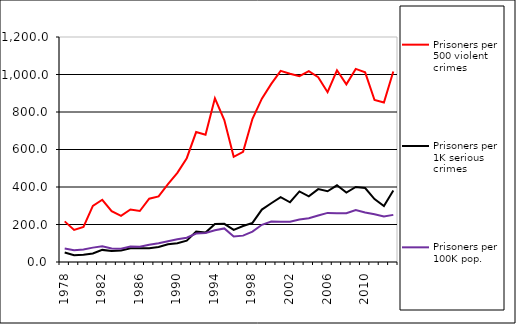
| Category | Prisoners per 500 violent crimes | Prisoners per 1K serious crimes | Prisoners per 100K pop. |
|---|---|---|---|
| 1978.0 | 216.667 | 50.489 | 72.074 |
| 1979.0 | 171.256 | 35.801 | 63.083 |
| 1980.0 | 187.09 | 39.22 | 66.888 |
| 1981.0 | 299.697 | 45.444 | 76.699 |
| 1982.0 | 332.061 | 64.588 | 84.302 |
| 1983.0 | 271.552 | 58.879 | 72 |
| 1984.0 | 245.774 | 61.404 | 71.321 |
| 1985.0 | 280.38 | 73.833 | 82.804 |
| 1986.0 | 271.995 | 73.881 | 81.146 |
| 1987.0 | 337.567 | 73.906 | 92.153 |
| 1988.0 | 349.558 | 80.273 | 99.46 |
| 1989.0 | 415.671 | 95.021 | 110.406 |
| 1990.0 | 475.559 | 99.634 | 121.011 |
| 1991.0 | 553.625 | 113.714 | 129.277 |
| 1992.0 | 693.109 | 162.289 | 151.754 |
| 1993.0 | 678.571 | 156.832 | 155.035 |
| 1994.0 | 872.776 | 202.854 | 169.138 |
| 1995.0 | 757.225 | 203.772 | 179.145 |
| 1996.0 | 560.924 | 171.227 | 135.993 |
| 1997.0 | 587.234 | 191.844 | 140.577 |
| 1998.0 | 763.535 | 208.751 | 162.267 |
| 1999.0 | 871.302 | 279.611 | 198.403 |
| 2000.0 | 950.072 | 313.216 | 215.661 |
| 2001.0 | 1019.41 | 346.073 | 214.2 |
| 2002.0 | 1003.799 | 318.544 | 214.306 |
| 2003.0 | 990.806 | 376.208 | 226.207 |
| 2004.0 | 1017.532 | 349.807 | 233.568 |
| 2005.0 | 985.934 | 388.707 | 247.756 |
| 2006.0 | 905.765 | 377.28 | 261.898 |
| 2007.0 | 1022.756 | 408.896 | 260.441 |
| 2008.0 | 947.307 | 370.336 | 260.527 |
| 2009.0 | 1029.869 | 400.186 | 277.277 |
| 2010.0 | 1011.656 | 394.403 | 263.528 |
| 2011.0 | 863.784 | 335.503 | 255.03 |
| 2012.0 | 850.73 | 299.014 | 242.191 |
| 2013.0 | 1016.129 | 381.633 | 251.254 |